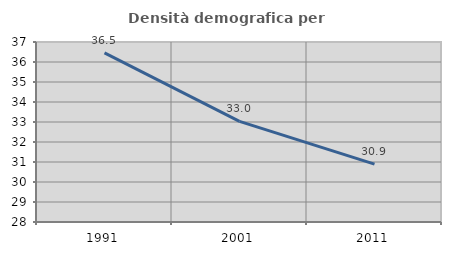
| Category | Densità demografica |
|---|---|
| 1991.0 | 36.457 |
| 2001.0 | 33.034 |
| 2011.0 | 30.894 |